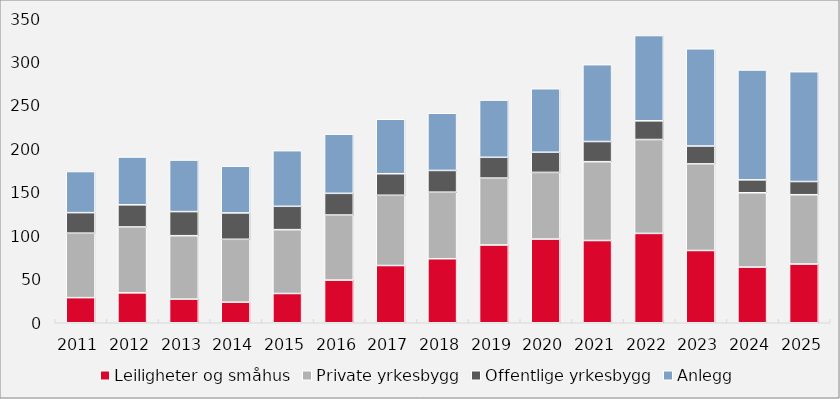
| Category | Leiligheter og småhus | Private yrkesbygg | Offentlige yrkesbygg | Anlegg |
|---|---|---|---|---|
| 2011.0 | 28.928 | 74.239 | 23.613 | 47.336 |
| 2012.0 | 34.438 | 75.86 | 25.502 | 55.006 |
| 2013.0 | 27.195 | 73.048 | 27.736 | 59.327 |
| 2014.0 | 23.669 | 72.424 | 30.324 | 53.815 |
| 2015.0 | 33.686 | 73.5 | 26.898 | 64.04 |
| 2016.0 | 49.11 | 74.934 | 24.944 | 68.169 |
| 2017.0 | 65.905 | 80.869 | 24.8 | 62.715 |
| 2018.0 | 73.73 | 76.618 | 24.994 | 65.851 |
| 2019.0 | 89.529 | 77.016 | 23.947 | 65.851 |
| 2020.0 | 96.336 | 76.765 | 23.233 | 73.095 |
| 2021.0 | 94.696 | 90.733 | 23.242 | 88.445 |
| 2022.0 | 102.864 | 108.084 | 21.56 | 98.174 |
| 2023.0 | 83.188 | 99.742 | 20.561 | 111.918 |
| 2024.0 | 64.088 | 85.579 | 14.882 | 126.467 |
| 2025.0 | 67.603 | 79.803 | 15.203 | 126.467 |